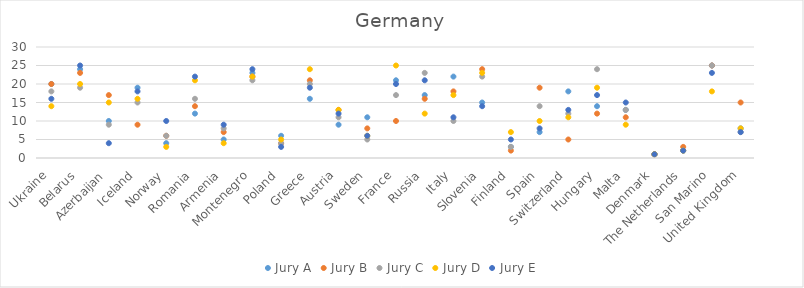
| Category | Jury A | Jury B | Jury C | Jury D | Jury E |
|---|---|---|---|---|---|
| Ukraine | 20 | 20 | 18 | 14 | 16 |
| Belarus | 24 | 23 | 19 | 20 | 25 |
| Azerbaijan | 10 | 17 | 9 | 15 | 4 |
| Iceland | 19 | 9 | 15 | 16 | 18 |
| Norway | 4 | 6 | 6 | 3 | 10 |
| Romania | 12 | 14 | 16 | 21 | 22 |
| Armenia | 5 | 7 | 8 | 4 | 9 |
| Montenegro | 23 | 22 | 21 | 22 | 24 |
| Poland | 6 | 4 | 4 | 5 | 3 |
| Greece | 16 | 21 | 20 | 24 | 19 |
| Austria | 9 | 13 | 11 | 13 | 12 |
| Sweden | 11 | 8 | 5 | 6 | 6 |
| France | 21 | 10 | 17 | 25 | 20 |
| Russia | 17 | 16 | 23 | 12 | 21 |
| Italy | 22 | 18 | 10 | 17 | 11 |
| Slovenia | 15 | 24 | 22 | 23 | 14 |
| Finland | 3 | 2 | 3 | 7 | 5 |
| Spain | 7 | 19 | 14 | 10 | 8 |
| Switzerland | 18 | 5 | 12 | 11 | 13 |
| Hungary | 14 | 12 | 24 | 19 | 17 |
| Malta | 13 | 11 | 13 | 9 | 15 |
| Denmark | 1 | 1 | 1 | 1 | 1 |
| The Netherlands | 2 | 3 | 2 | 2 | 2 |
| San Marino | 25 | 25 | 25 | 18 | 23 |
| United Kingdom | 8 | 15 | 7 | 8 | 7 |